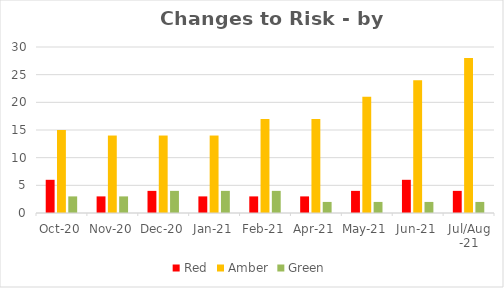
| Category | Red | Amber | Green |
|---|---|---|---|
| Oct-20 | 6 | 15 | 3 |
| Nov-20 | 3 | 14 | 3 |
| Dec-20 | 4 | 14 | 4 |
| Jan-21 | 3 | 14 | 4 |
| Feb-21 | 3 | 17 | 4 |
| Apr-21 | 3 | 17 | 2 |
| May-21 | 4 | 21 | 2 |
| Jun-21 | 6 | 24 | 2 |
| Jul/Aug -21 | 4 | 28 | 2 |